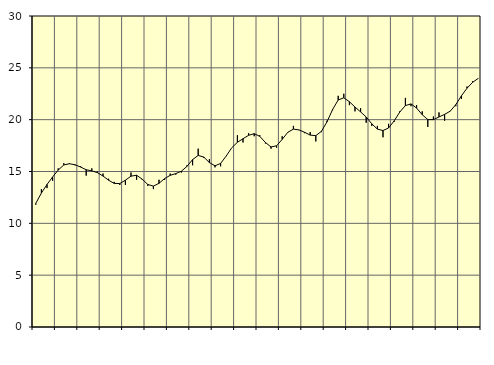
| Category | Piggar | Series 1 |
|---|---|---|
| nan | 11.8 | 11.93 |
| 1.0 | 13.3 | 12.92 |
| 1.0 | 13.4 | 13.75 |
| 1.0 | 14.1 | 14.47 |
| nan | 15.3 | 15.14 |
| 2.0 | 15.8 | 15.63 |
| 2.0 | 15.8 | 15.75 |
| 2.0 | 15.6 | 15.65 |
| nan | 15.5 | 15.43 |
| 3.0 | 14.6 | 15.17 |
| 3.0 | 15.3 | 15.06 |
| 3.0 | 15 | 14.89 |
| nan | 14.8 | 14.56 |
| 4.0 | 14.3 | 14.16 |
| 4.0 | 14 | 13.85 |
| 4.0 | 13.7 | 13.84 |
| nan | 13.7 | 14.16 |
| 5.0 | 14.9 | 14.55 |
| 5.0 | 14.2 | 14.64 |
| 5.0 | 14.2 | 14.26 |
| nan | 13.6 | 13.75 |
| 6.0 | 13.3 | 13.59 |
| 6.0 | 14.2 | 13.86 |
| 6.0 | 14.2 | 14.32 |
| nan | 14.8 | 14.63 |
| 7.0 | 14.7 | 14.8 |
| 7.0 | 14.9 | 15.03 |
| 7.0 | 15.6 | 15.5 |
| nan | 15.6 | 16.15 |
| 8.0 | 17.2 | 16.55 |
| 8.0 | 16.3 | 16.39 |
| 8.0 | 16.2 | 15.86 |
| nan | 15.4 | 15.55 |
| 9.0 | 15.5 | 15.78 |
| 9.0 | 16.5 | 16.49 |
| 9.0 | 17.3 | 17.3 |
| nan | 18.5 | 17.82 |
| 10.0 | 17.8 | 18.16 |
| 10.0 | 18.7 | 18.49 |
| 10.0 | 18.4 | 18.65 |
| nan | 18.5 | 18.39 |
| 11.0 | 17.7 | 17.8 |
| 11.0 | 17.2 | 17.37 |
| 11.0 | 17.3 | 17.48 |
| nan | 18.4 | 18.1 |
| 12.0 | 18.8 | 18.78 |
| 12.0 | 19.4 | 19.09 |
| 12.0 | 19 | 19.01 |
| nan | 18.7 | 18.78 |
| 13.0 | 18.8 | 18.51 |
| 13.0 | 17.9 | 18.46 |
| 13.0 | 18.8 | 18.87 |
| nan | 19.9 | 19.79 |
| 14.0 | 20.9 | 20.98 |
| 14.0 | 22.3 | 21.9 |
| 14.0 | 22.5 | 22.11 |
| nan | 21.4 | 21.73 |
| 15.0 | 20.8 | 21.22 |
| 15.0 | 21.1 | 20.75 |
| 15.0 | 19.7 | 20.26 |
| nan | 19.4 | 19.6 |
| 16.0 | 19.4 | 19.09 |
| 16.0 | 18.3 | 18.95 |
| 16.0 | 19.6 | 19.2 |
| nan | 19.8 | 19.89 |
| 17.0 | 20.8 | 20.74 |
| 17.0 | 22.1 | 21.36 |
| 17.0 | 21.3 | 21.52 |
| nan | 21.4 | 21.12 |
| 18.0 | 20.8 | 20.48 |
| 18.0 | 19.3 | 20.01 |
| 18.0 | 20.3 | 20 |
| nan | 20.7 | 20.26 |
| 19.0 | 19.9 | 20.51 |
| 19.0 | 20.8 | 20.82 |
| 19.0 | 21.3 | 21.45 |
| nan | 22 | 22.3 |
| 20.0 | 23.2 | 23.03 |
| 20.0 | 23.7 | 23.6 |
| 20.0 | 24 | 23.98 |